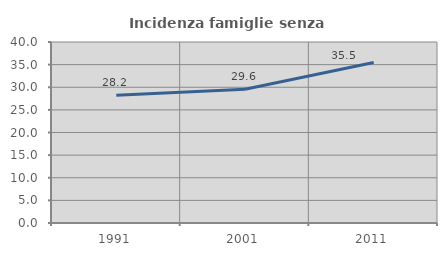
| Category | Incidenza famiglie senza nuclei |
|---|---|
| 1991.0 | 28.223 |
| 2001.0 | 29.556 |
| 2011.0 | 35.484 |